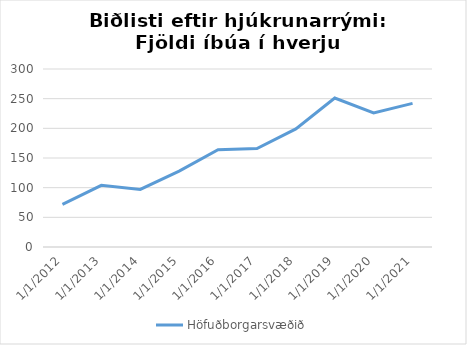
| Category | Höfuðborgarsvæðið |
|---|---|
| 1/1/12 | 72 |
| 1/1/13 | 104 |
| 1/1/14 | 97 |
| 1/1/15 | 128 |
| 1/1/16 | 164 |
| 1/1/17 | 166 |
| 1/1/18 | 199 |
| 1/1/19 | 251 |
| 1/1/20 | 226 |
| 1/1/21 | 242 |